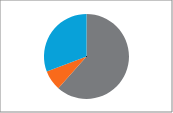
| Category | Effectifs 
n | Pourcentage
% |
|---|---|---|
| [ 30 - 35 [ | 8 | 0.571 |
| [ 35 - 40 [ | 1 | 0.286 |
| [ 40 - 45 [ | 4 | 0.143 |